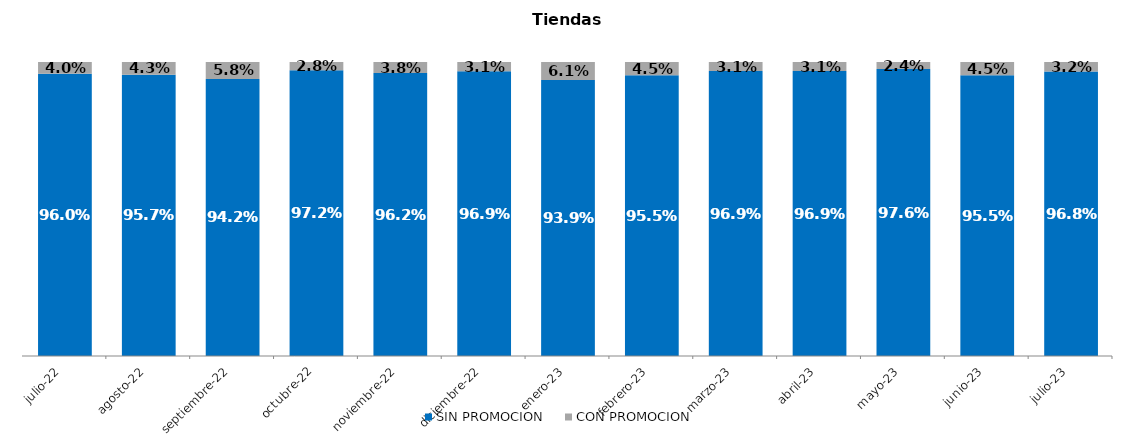
| Category | SIN PROMOCION   | CON PROMOCION   |
|---|---|---|
| 2022-07-01 | 0.96 | 0.04 |
| 2022-08-01 | 0.957 | 0.043 |
| 2022-09-01 | 0.942 | 0.058 |
| 2022-10-01 | 0.972 | 0.028 |
| 2022-11-01 | 0.962 | 0.038 |
| 2022-12-01 | 0.969 | 0.031 |
| 2023-01-01 | 0.939 | 0.061 |
| 2023-02-01 | 0.955 | 0.045 |
| 2023-03-01 | 0.969 | 0.031 |
| 2023-04-01 | 0.969 | 0.031 |
| 2023-05-01 | 0.976 | 0.024 |
| 2023-06-01 | 0.955 | 0.045 |
| 2023-07-01 | 0.968 | 0.032 |